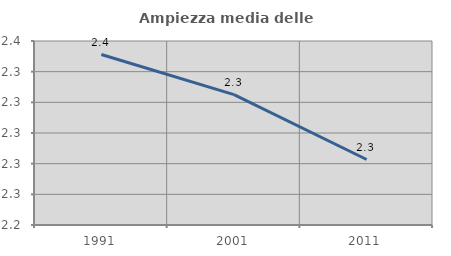
| Category | Ampiezza media delle famiglie |
|---|---|
| 1991.0 | 2.351 |
| 2001.0 | 2.325 |
| 2011.0 | 2.283 |